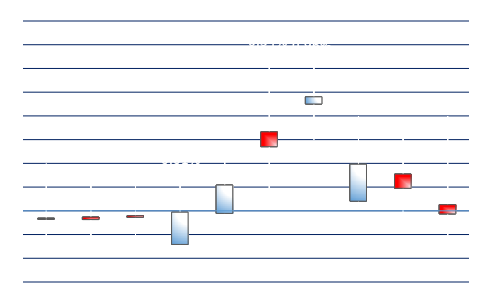
| Category | Series 0 | Series 1 | Series 2 | Series 3 |
|---|---|---|---|---|
| YMM7 | -0.001 | 0.004 | -0.003 | -0.001 |
| EPM7 | -0.001 | 0.003 | -0.003 | -0.001 |
| ENQM7 | 0 | 0.004 | -0.003 | -0.001 |
| EMDM7 | -0.003 | 0.003 | -0.004 | 0 |
| TFEM7 | 0 | 0.006 | -0.001 | 0.002 |
| DDH7 | 0.007 | 0.013 | 0.002 | 0.005 |
| DSXM7 | 0.009 | 0.013 | 0.006 | 0.01 |
| QFAH7 | 0.001 | 0.008 | 0 | 0.004 |
| PILH7 | 0.003 | 0.006 | 0 | 0.002 |
| NKDM7 | 0.001 | 0.008 | -0.003 | 0 |